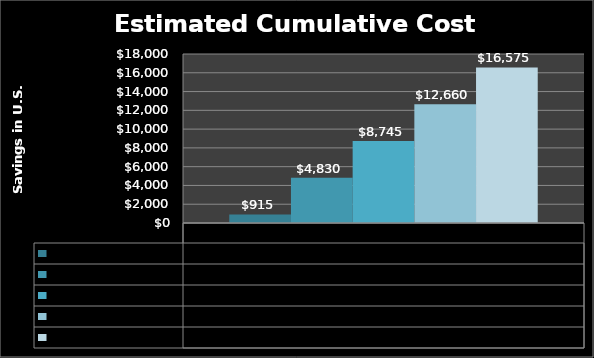
| Category | Cost Savings Year 1 | Cost Savings Year 2 | Cost Savings Year 3 | Cost Savings Year 4 | Cost Savings Year 5 |
|---|---|---|---|---|---|
| 0 | 915 | 4830 | 8745 | 12660 | 16575 |